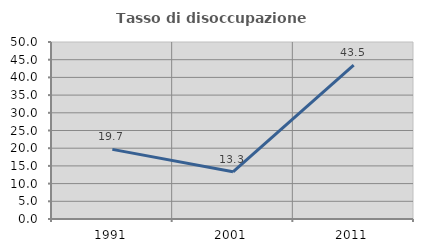
| Category | Tasso di disoccupazione giovanile  |
|---|---|
| 1991.0 | 19.672 |
| 2001.0 | 13.333 |
| 2011.0 | 43.478 |